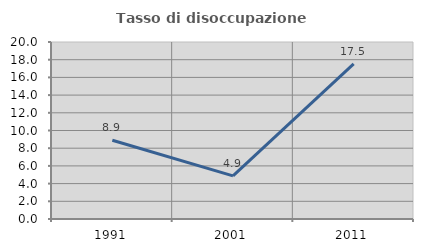
| Category | Tasso di disoccupazione giovanile  |
|---|---|
| 1991.0 | 8.897 |
| 2001.0 | 4.878 |
| 2011.0 | 17.534 |